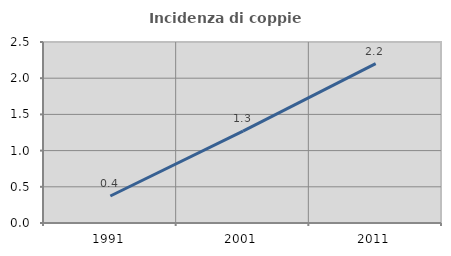
| Category | Incidenza di coppie miste |
|---|---|
| 1991.0 | 0.373 |
| 2001.0 | 1.27 |
| 2011.0 | 2.202 |